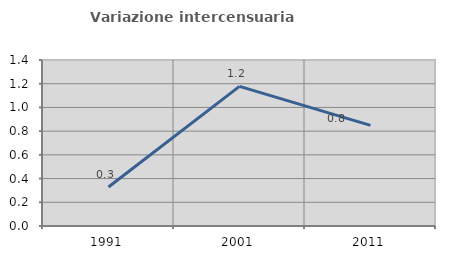
| Category | Variazione intercensuaria annua |
|---|---|
| 1991.0 | 0.329 |
| 2001.0 | 1.178 |
| 2011.0 | 0.849 |